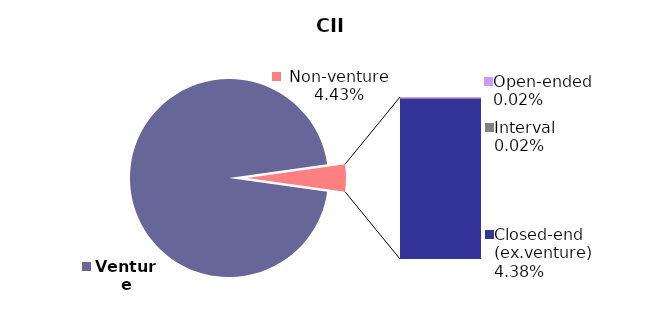
| Category | 31.12.2019 |
|---|---|
| Venture | 0.956 |
| Open-ended | 0 |
| Interval | 0 |
| Closed-end (ex.venture) | 0.044 |